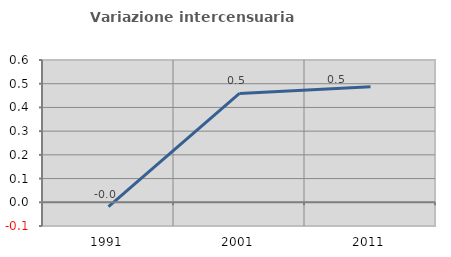
| Category | Variazione intercensuaria annua |
|---|---|
| 1991.0 | -0.018 |
| 2001.0 | 0.459 |
| 2011.0 | 0.487 |